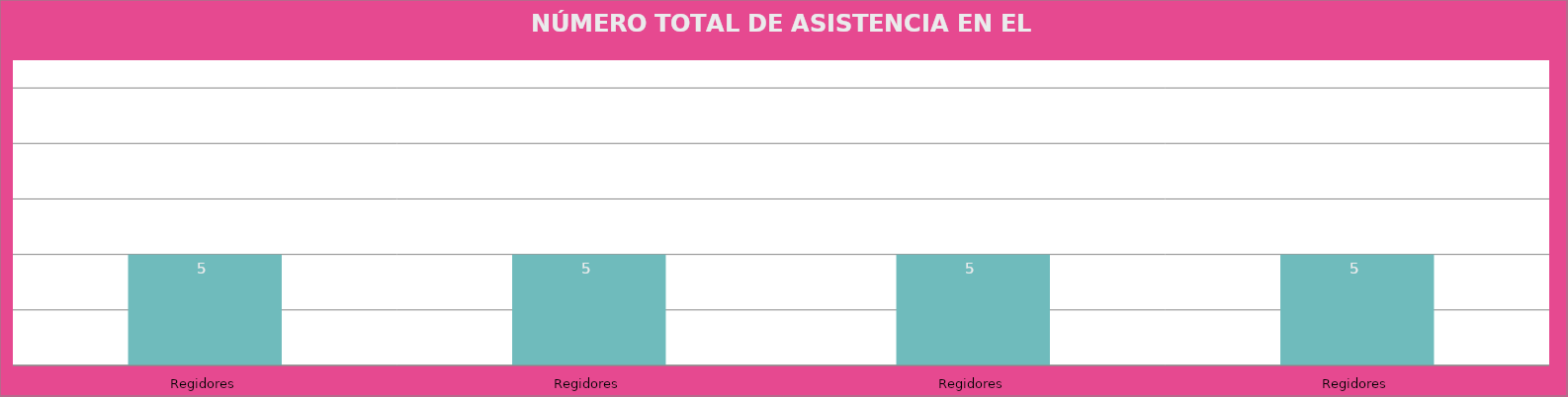
| Category | Regidores |
|---|---|
| Regidores | 5 |
| Regidores | 5 |
| Regidores | 5 |
| Regidores | 5 |